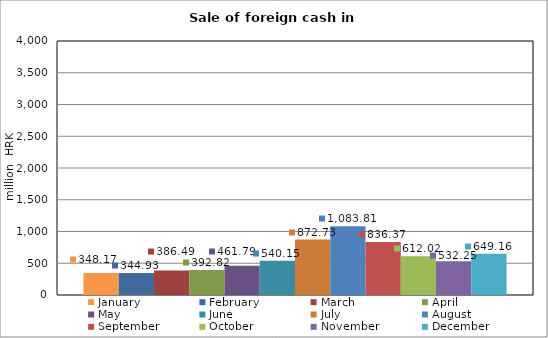
| Category | January | February | March | April | May | June | July | August | September | October | November | December |
|---|---|---|---|---|---|---|---|---|---|---|---|---|
| 0 | 348.171 | 344.929 | 386.485 | 392.82 | 461.788 | 540.146 | 872.732 | 1083.812 | 836.371 | 612.024 | 532.25 | 649.164 |